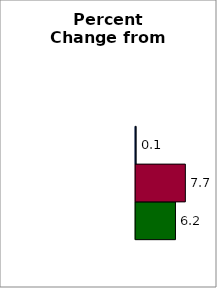
| Category | 50 states and D.C. | SREB states | State |
|---|---|---|---|
| 0 | 6.185 | 7.722 | 0.074 |